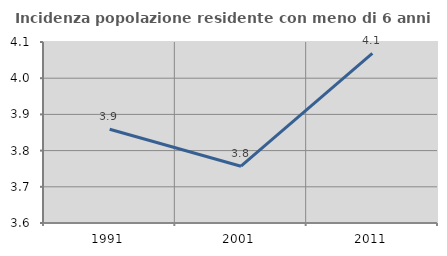
| Category | Incidenza popolazione residente con meno di 6 anni |
|---|---|
| 1991.0 | 3.859 |
| 2001.0 | 3.757 |
| 2011.0 | 4.069 |